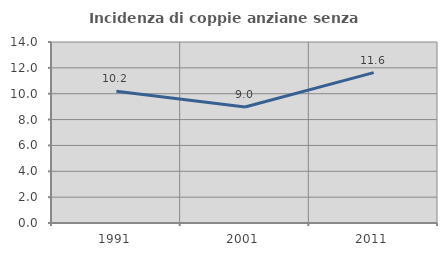
| Category | Incidenza di coppie anziane senza figli  |
|---|---|
| 1991.0 | 10.191 |
| 2001.0 | 8.974 |
| 2011.0 | 11.628 |